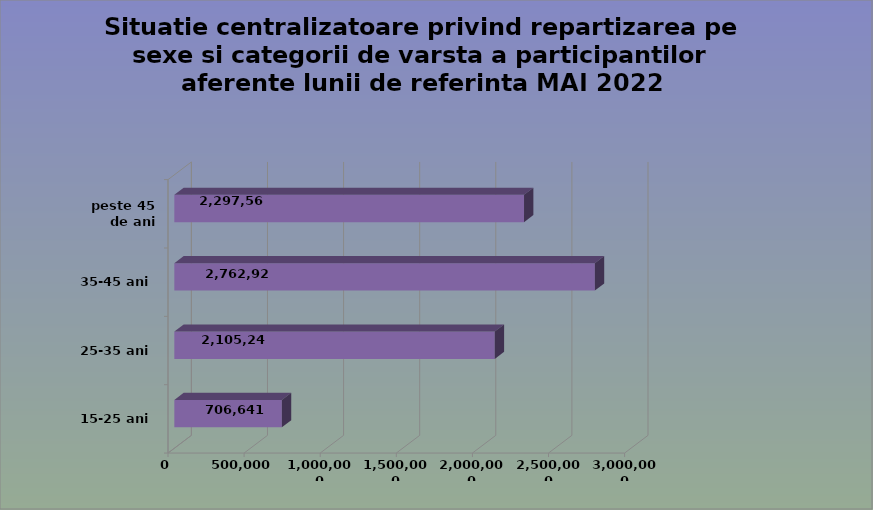
| Category | 15-25 ani 25-35 ani 35-45 ani peste 45 de ani |
|---|---|
| 15-25 ani | 706641 |
| 25-35 ani | 2105244 |
| 35-45 ani | 2762925 |
| peste 45 de ani | 2297564 |